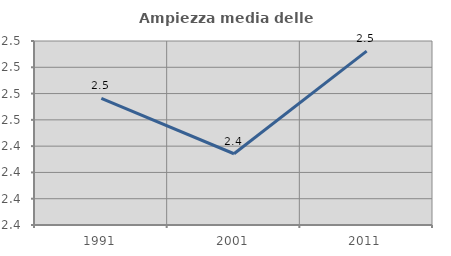
| Category | Ampiezza media delle famiglie |
|---|---|
| 1991.0 | 2.476 |
| 2001.0 | 2.434 |
| 2011.0 | 2.512 |